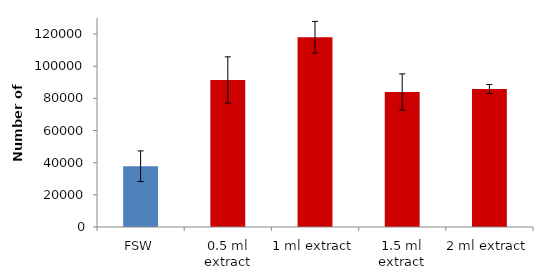
| Category | Series 0 |
|---|---|
| FSW | 37804.262 |
| 0.5 ml extract | 91475.005 |
| 1 ml extract | 118079.734 |
| 1.5 ml extract | 83957.844 |
| 2 ml extract | 85797.955 |